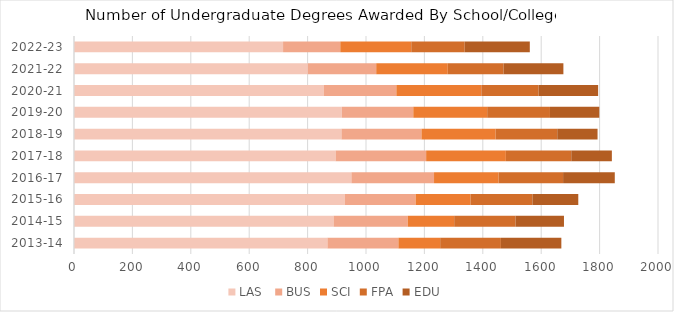
| Category | LAS  | BUS | SCI | FPA | EDU |
|---|---|---|---|---|---|
| 2013-14 | 868 | 243 | 143 | 208 | 207 |
| 2014-15 | 889 | 254 | 159 | 210 | 166 |
| 2015-16 | 927 | 243 | 188 | 212 | 157 |
| 2016-17 | 950 | 283 | 221 | 221 | 177 |
| 2017-18 | 896 | 310 | 273 | 224 | 139 |
| 2018-19 | 916 | 274 | 254 | 211 | 138 |
| 2019-20 | 917 | 245 | 253 | 215 | 169 |
| 2020-21 | 855 | 249 | 291 | 196 | 204 |
| 2021-22 | 801 | 234 | 245 | 191 | 205 |
| 2022-23 | 716 | 196 | 243 | 183 | 223 |